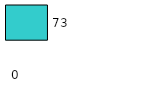
| Category | Series 0 | Series 1 |
|---|---|---|
| 0 | 0 | 73 |